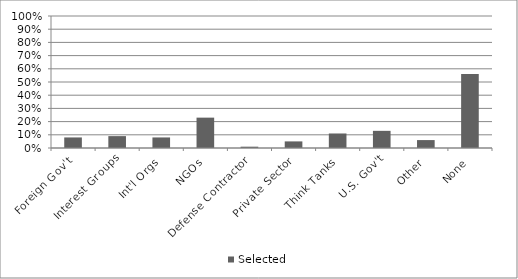
| Category | Selected |
|---|---|
| Foreign Gov't | 0.08 |
| Interest Groups | 0.09 |
| Int'l Orgs | 0.08 |
| NGOs | 0.23 |
| Defense Contractor | 0.01 |
| Private Sector | 0.05 |
| Think Tanks | 0.11 |
| U.S. Gov't | 0.13 |
| Other | 0.06 |
| None | 0.56 |